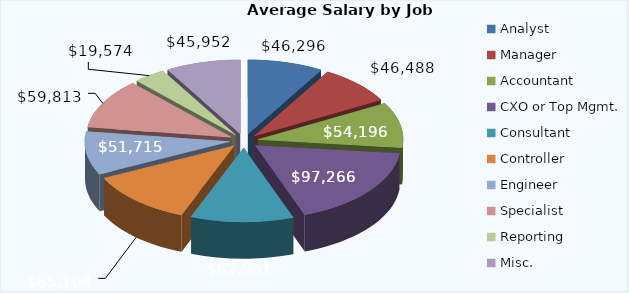
| Category | Series 0 |
|---|---|
| Analyst | 46295.769 |
| Manager | 46488.241 |
| Accountant | 54196.441 |
| CXO or Top Mgmt. | 97265.876 |
| Consultant | 62950.733 |
| Controller | 65103.929 |
| Engineer | 51715.151 |
| Specialist | 59812.969 |
| Reporting | 19574.159 |
| Misc. | 45952.334 |